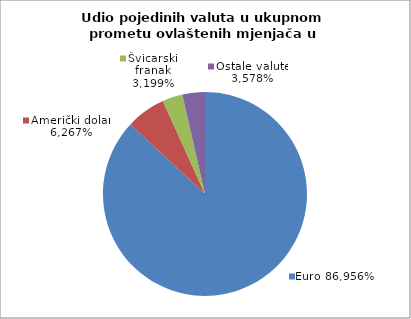
| Category | EUR |
|---|---|
| 0 | 0.87 |
| 1 | 0.063 |
| 2 | 0.032 |
| 3 | 0.036 |